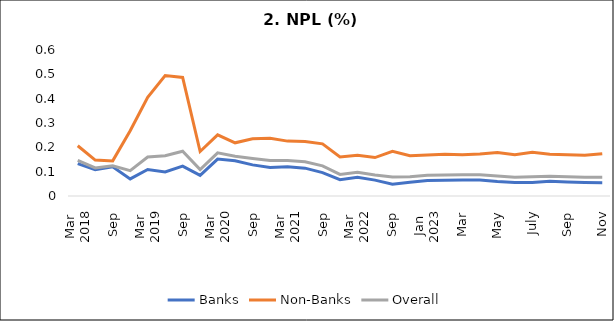
| Category | Banks | Non-Banks | Overall |
|---|---|---|---|
| 0 | 0.133 | 0.207 | 0.146 |
| 1 | 0.108 | 0.148 | 0.115 |
| 2 | 0.12 | 0.144 | 0.124 |
| 3 | 0.07 | 0.268 | 0.104 |
| 4 | 0.109 | 0.406 | 0.16 |
| 5 | 0.099 | 0.495 | 0.165 |
| 6 | 0.123 | 0.487 | 0.184 |
| 7 | 0.084 | 0.183 | 0.109 |
| 8 | 0.152 | 0.251 | 0.177 |
| 9 | 0.145 | 0.218 | 0.164 |
| 10 | 0.128 | 0.235 | 0.154 |
| 11 | 0.117 | 0.237 | 0.146 |
| 12 | 0.121 | 0.226 | 0.146 |
| 13 | 0.115 | 0.224 | 0.141 |
| 14 | 0.096 | 0.214 | 0.124 |
| 15 | 0.067 | 0.16 | 0.089 |
| 16 | 0.077 | 0.168 | 0.098 |
| 17 | 0.065 | 0.158 | 0.086 |
| 18 | 0.048 | 0.183 | 0.078 |
| 19 | 0.057 | 0.165 | 0.079 |
| 20 | 0.063 | 0.169 | 0.085 |
| 21 | 0.065 | 0.171 | 0.086 |
| 22 | 0.066 | 0.169 | 0.087 |
| 23 | 0.066 | 0.173 | 0.087 |
| 24 | 0.06 | 0.178 | 0.082 |
| 25 | 0.055 | 0.17 | 0.077 |
| 26 | 0.056 | 0.179 | 0.079 |
| 27 | 0.06 | 0.172 | 0.081 |
| 28 | 0.057 | 0.17 | 0.079 |
| 29 | 0.055 | 0.167 | 0.077 |
| 30 | 0.055 | 0.174 | 0.077 |